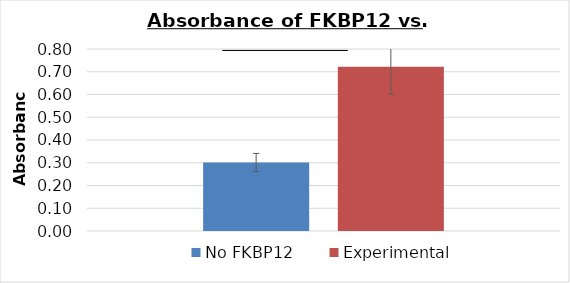
| Category | No FKBP12 | Experimental |
|---|---|---|
| 0 | 0.301 | 0.722 |